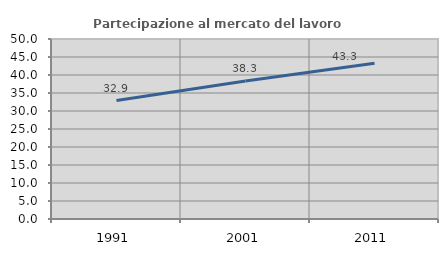
| Category | Partecipazione al mercato del lavoro  femminile |
|---|---|
| 1991.0 | 32.911 |
| 2001.0 | 38.313 |
| 2011.0 | 43.265 |